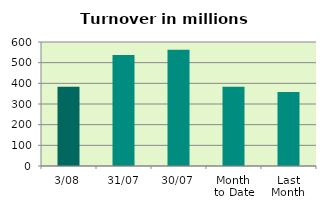
| Category | Series 0 |
|---|---|
| 3/08 | 383.206 |
| 31/07 | 536.698 |
| 30/07 | 562.888 |
| Month 
to Date | 383.206 |
| Last
Month | 357.784 |